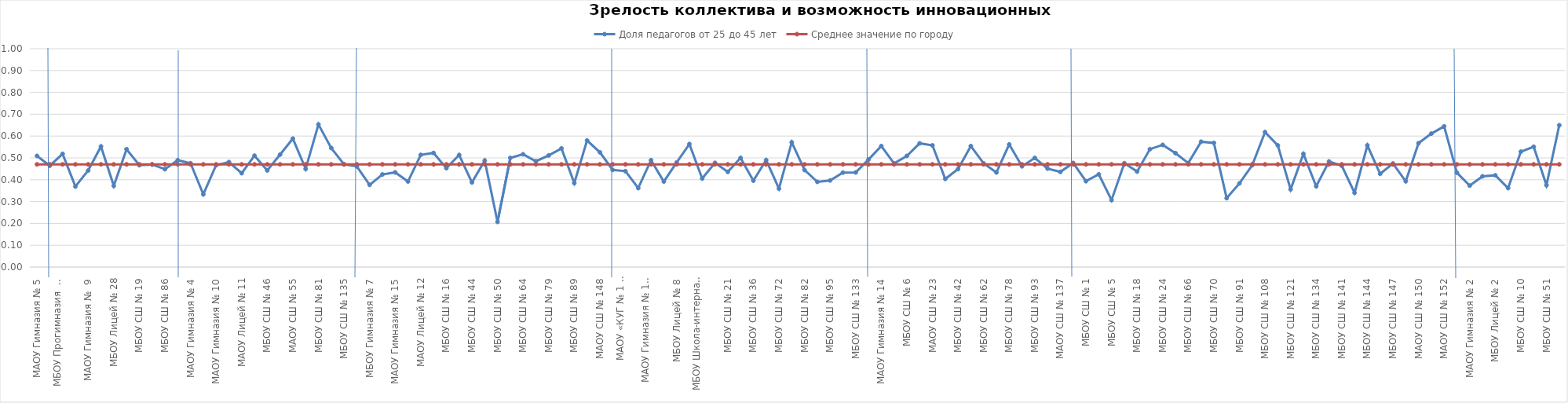
| Category | Доля педагогов от 25 до 45 лет | Среднее значение по городу |
|---|---|---|
| МАОУ Гимназия № 5 | 0.509 | 0.47 |
| ЖЕЛЕЗНОДОРОЖНЫЙ РАЙОН | 0.464 | 0.47 |
| МБОУ Прогимназия  № 131 | 0.519 | 0.47 |
| МБОУ Гимназия № 8 | 0.369 | 0.47 |
| МАОУ Гимназия №  9 | 0.442 | 0.47 |
| МАОУ Лицей № 7 | 0.552 | 0.47 |
| МБОУ Лицей № 28 | 0.372 | 0.47 |
| МБОУ СШ  № 12 | 0.54 | 0.47 |
| МБОУ СШ № 19 | 0.467 | 0.47 |
| МАОУ СШ № 32 | 0.47 | 0.47 |
| МБОУ СШ № 86 | 0.448 | 0.47 |
| КИРОВСКИЙ РАЙОН | 0.489 | 0.47 |
| МАОУ Гимназия № 4 | 0.476 | 0.47 |
| МАОУ Гимназия № 6 | 0.333 | 0.47 |
| МАОУ Гимназия № 10 | 0.467 | 0.47 |
| МАОУ Лицей № 6 "Перспектива" | 0.481 | 0.47 |
| МАОУ Лицей № 11 | 0.43 | 0.47 |
| МБОУ СШ № 8 "Созидание" | 0.51 | 0.47 |
| МБОУ СШ № 46 | 0.443 | 0.47 |
| МБОУ СШ № 49 | 0.515 | 0.47 |
| МАОУ СШ № 55 | 0.588 | 0.47 |
| МБОУ СШ № 63 | 0.449 | 0.47 |
| МБОУ СШ № 81 | 0.653 | 0.47 |
| МБОУ СШ № 90 | 0.545 | 0.47 |
| МБОУ СШ № 135 | 0.471 | 0.47 |
| ЛЕНИНСКИЙ РАЙОН | 0.461 | 0.47 |
| МБОУ Гимназия № 7 | 0.377 | 0.47 |
| МАОУ Гимназия № 11 | 0.424 | 0.47 |
| МАОУ Гимназия № 15 | 0.434 | 0.47 |
| МБОУ Лицей № 3 | 0.392 | 0.47 |
| МАОУ Лицей № 12 | 0.514 | 0.47 |
| МБОУ СШ № 13 | 0.523 | 0.47 |
| МБОУ СШ № 16 | 0.453 | 0.47 |
| МБОУ СШ № 31 | 0.514 | 0.47 |
| МБОУ СШ № 44 | 0.388 | 0.47 |
| МБОУ СШ № 47 | 0.488 | 0.47 |
| МБОУ СШ № 50 | 0.207 | 0.47 |
| МБОУ СШ № 53 | 0.5 | 0.47 |
| МБОУ СШ № 64 | 0.517 | 0.47 |
| МБОУ СШ № 65 | 0.485 | 0.47 |
| МБОУ СШ № 79 | 0.511 | 0.47 |
| МБОУ СШ № 88 | 0.543 | 0.47 |
| МБОУ СШ № 89 | 0.385 | 0.47 |
| МБОУ СШ № 94 | 0.58 | 0.47 |
| МАОУ СШ № 148 | 0.526 | 0.47 |
| ОКТЯБРЬСКИЙ РАЙОН | 0.445 | 0.47 |
| МАОУ «КУГ № 1 – Универс» | 0.439 | 0.47 |
| МАОУ Гимназия № 3 | 0.362 | 0.47 |
| МАОУ Гимназия № 13 "Академ" | 0.489 | 0.47 |
| МАОУ Лицей № 1 | 0.392 | 0.47 |
| МБОУ Лицей № 8 | 0.479 | 0.47 |
| МБОУ Лицей № 10 | 0.563 | 0.47 |
| МБОУ Школа-интернат № 1 | 0.405 | 0.47 |
| МБОУ СШ № 3 | 0.477 | 0.47 |
| МБОУ СШ № 21 | 0.436 | 0.47 |
| МБОУ СШ № 30 | 0.5 | 0.47 |
| МБОУ СШ № 36 | 0.396 | 0.47 |
| МБОУ СШ № 39 | 0.49 | 0.47 |
| МБОУ СШ № 72 | 0.359 | 0.47 |
| МБОУ СШ № 73 | 0.571 | 0.47 |
| МБОУ СШ № 82 | 0.444 | 0.47 |
| МБОУ СШ № 84 | 0.39 | 0.47 |
| МБОУ СШ № 95 | 0.397 | 0.47 |
| МБОУ СШ № 99 | 0.433 | 0.47 |
| МБОУ СШ № 133 | 0.433 | 0.47 |
| СВЕРДЛОВСКИЙ РАЙОН | 0.492 | 0.47 |
| МАОУ Гимназия № 14 | 0.554 | 0.47 |
| МАОУ Лицей № 9 "Лидер" | 0.475 | 0.47 |
| МБОУ СШ № 6 | 0.509 | 0.47 |
| МБОУ СШ № 17 | 0.567 | 0.47 |
| МАОУ СШ № 23 | 0.557 | 0.47 |
| МБОУ СШ № 34 | 0.404 | 0.47 |
| МБОУ СШ № 42 | 0.449 | 0.47 |
| МБОУ СШ № 45 | 0.554 | 0.47 |
| МБОУ СШ № 62 | 0.475 | 0.47 |
| МБОУ СШ № 76 | 0.433 | 0.47 |
| МБОУ СШ № 78 | 0.562 | 0.47 |
| МБОУ СШ № 92 | 0.462 | 0.47 |
| МБОУ СШ № 93 | 0.5 | 0.47 |
| МБОУ СШ № 97 | 0.451 | 0.47 |
| МАОУ СШ № 137 | 0.436 | 0.47 |
| СОВЕТСКИЙ РАЙОН | 0.477 | 0.47 |
| МБОУ СШ № 1 | 0.393 | 0.47 |
| МБОУ СШ № 2 | 0.425 | 0.47 |
| МБОУ СШ № 5 | 0.307 | 0.47 |
| МБОУ СШ № 7 | 0.476 | 0.47 |
| МБОУ СШ № 18 | 0.438 | 0.47 |
| МАОУ СШ № 22 | 0.54 | 0.47 |
| МБОУ СШ № 24 | 0.56 | 0.47 |
| МБОУ СШ № 56 | 0.522 | 0.47 |
| МБОУ СШ № 66 | 0.476 | 0.47 |
| МБОУ СШ № 69 | 0.574 | 0.47 |
| МБОУ СШ № 70 | 0.569 | 0.47 |
| МБОУ СШ № 85 | 0.316 | 0.47 |
| МБОУ СШ № 91 | 0.383 | 0.47 |
| МБОУ СШ № 98 | 0.467 | 0.47 |
| МБОУ СШ № 108 | 0.618 | 0.47 |
| МБОУ СШ № 115 | 0.557 | 0.47 |
| МБОУ СШ № 121 | 0.356 | 0.47 |
| МБОУ СШ № 129 | 0.519 | 0.47 |
| МБОУ СШ № 134 | 0.37 | 0.47 |
| МБОУ СШ № 139 | 0.484 | 0.47 |
| МБОУ СШ № 141 | 0.464 | 0.47 |
| МАОУ СШ № 143 | 0.34 | 0.47 |
| МБОУ СШ № 144 | 0.557 | 0.47 |
| МАОУ СШ № 145 | 0.427 | 0.47 |
| МБОУ СШ № 147 | 0.474 | 0.47 |
| МАОУ СШ № 149 | 0.393 | 0.47 |
| МАОУ СШ № 150 | 0.567 | 0.47 |
| МАОУ СШ № 151 | 0.611 | 0.47 |
| МАОУ СШ № 152 | 0.644 | 0.47 |
| ЦЕНТРАЛЬНЫЙ РАЙОН | 0.432 | 0.47 |
| МАОУ Гимназия № 2 | 0.373 | 0.47 |
| МБОУ  Гимназия № 16 | 0.416 | 0.47 |
| МБОУ Лицей № 2 | 0.42 | 0.47 |
| МБОУ СШ № 4 | 0.362 | 0.47 |
| МБОУ СШ № 10 | 0.529 | 0.47 |
| МБОУ СШ № 27 | 0.551 | 0.47 |
| МБОУ СШ № 51 | 0.375 | 0.47 |
| МАОУ СШ № 153 | 0.65 | 0.47 |